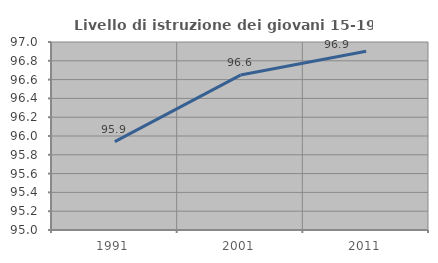
| Category | Livello di istruzione dei giovani 15-19 anni |
|---|---|
| 1991.0 | 95.94 |
| 2001.0 | 96.648 |
| 2011.0 | 96.901 |